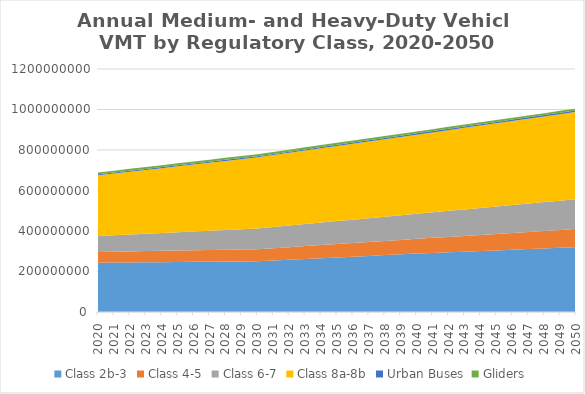
| Category | Class 2b-3 | Class 4-5 | Class 6-7 | Class 8a-8b | Urban Buses | Gliders |
|---|---|---|---|---|---|---|
| 2020.0 | 243476796.308 | 53165241.538 | 78819287.692 | 299423065.846 | 5052978.827 | 8998285.692 |
| 2021.0 | 244157835.077 | 53833495.385 | 81202202.923 | 304580866.462 | 5075728.769 | 9113638.923 |
| 2022.0 | 244838873.846 | 54501749.231 | 83585118.154 | 309738667.077 | 5098478.712 | 9228992.154 |
| 2023.0 | 245519912.615 | 55170003.077 | 85968033.385 | 314896467.692 | 5121228.654 | 9344345.385 |
| 2024.0 | 246200951.385 | 55838256.923 | 88350948.615 | 320054268.308 | 5143978.596 | 9459698.615 |
| 2025.0 | 246881990.154 | 56506510.769 | 90733863.846 | 325212068.923 | 5166728.538 | 9575051.846 |
| 2026.0 | 247563028.923 | 57174764.615 | 93116779.077 | 330369869.538 | 5189478.481 | 9690405.077 |
| 2027.0 | 248244067.692 | 57843018.462 | 95499694.308 | 335527670.154 | 5212228.423 | 9805758.308 |
| 2028.0 | 248925106.462 | 58511272.308 | 97882609.538 | 340685470.769 | 5234978.365 | 9921111.538 |
| 2029.0 | 249606145.231 | 59179526.154 | 100265524.769 | 345843271.385 | 5257728.308 | 10036464.769 |
| 2030.0 | 250287184 | 59847780 | 102648440 | 351001072 | 5280478.25 | 10151818 |
| 2031.0 | 254123615.2 | 61115167.2 | 104770070 | 354962161.6 | 5398582.925 | 10106835.1 |
| 2032.0 | 257960046.4 | 62382554.4 | 106891700 | 358923251.2 | 5516687.6 | 10061852.2 |
| 2033.0 | 261796477.6 | 63649941.6 | 109013330 | 362884340.8 | 5634792.275 | 10016869.3 |
| 2034.0 | 265632908.8 | 64917328.8 | 111134960 | 366845430.4 | 5752896.95 | 9971886.4 |
| 2035.0 | 269469340 | 66184716 | 113256590 | 370806520 | 5871001.625 | 9926903.5 |
| 2036.0 | 273305771.2 | 67452103.2 | 115378220 | 374767609.6 | 5989106.3 | 9881920.6 |
| 2037.0 | 277142202.4 | 68719490.4 | 117499850 | 378728699.2 | 6107210.975 | 9836937.7 |
| 2038.0 | 280978633.6 | 69986877.6 | 119621480 | 382689788.8 | 6225315.65 | 9791954.8 |
| 2039.0 | 284815064.8 | 71254264.8 | 121743110 | 386650878.4 | 6343420.325 | 9746971.9 |
| 2040.0 | 288651496 | 72521652 | 123864740 | 390611968 | 6461525 | 9701989 |
| 2041.0 | 291774498.4 | 74302266 | 126156030.4 | 394655969.6 | 6557428.2 | 9636814.2 |
| 2042.0 | 294897500.8 | 76082880 | 128447320.8 | 398699971.2 | 6653331.4 | 9571639.4 |
| 2043.0 | 298020503.2 | 77863494 | 130738611.2 | 402743972.8 | 6749234.6 | 9506464.6 |
| 2044.0 | 301143505.6 | 79644108 | 133029901.6 | 406787974.4 | 6845137.8 | 9441289.8 |
| 2045.0 | 304266508 | 81424722 | 135321192 | 410831976 | 6941041 | 9376115 |
| 2046.0 | 307389510.4 | 83205336 | 137612482.4 | 414875977.6 | 7036944.2 | 9310940.2 |
| 2047.0 | 310512512.8 | 84985950 | 139903772.8 | 418919979.2 | 7132847.4 | 9245765.4 |
| 2048.0 | 313635515.2 | 86766564 | 142195063.2 | 422963980.8 | 7228750.6 | 9180590.6 |
| 2049.0 | 316758517.6 | 88547178 | 144486353.6 | 427007982.4 | 7324653.8 | 9115415.8 |
| 2050.0 | 319881520 | 90327792 | 146777644 | 431051984 | 7420557 | 9050241 |